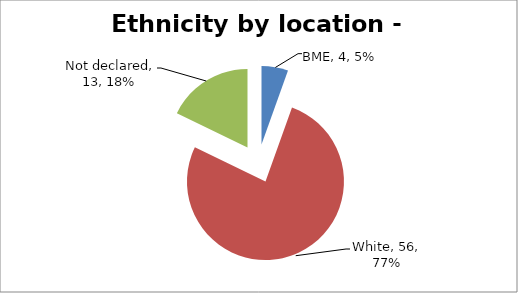
| Category | Series 0 |
|---|---|
| BME | 4 |
| White | 56 |
| Not declared | 13 |